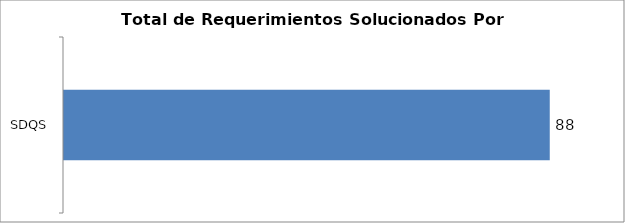
| Category | Total |
|---|---|
| SDQS | 88 |